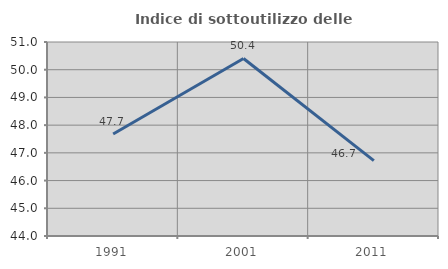
| Category | Indice di sottoutilizzo delle abitazioni  |
|---|---|
| 1991.0 | 47.679 |
| 2001.0 | 50.407 |
| 2011.0 | 46.718 |